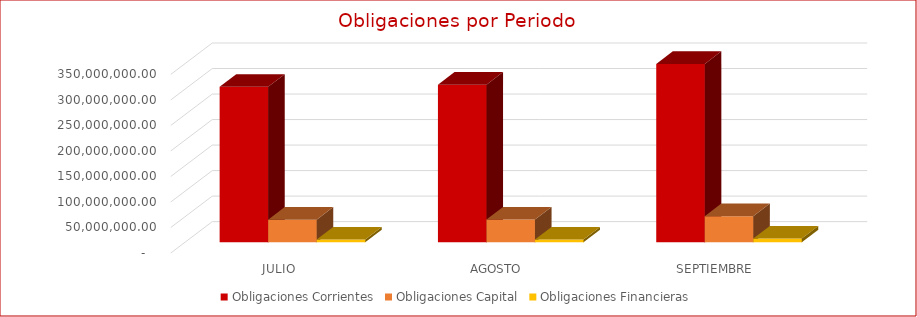
| Category | Obligaciones Corrientes | Obligaciones Capital | Obligaciones Financieras |
|---|---|---|---|
| JULIO | 304846809.23 | 44284262.12 | 5328301.21 |
| AGOSTO | 308838113.51 | 44728287.76 | 5328301.21 |
| SEPTIEMBRE | 349512532.82 | 51228316.44 | 7487504.59 |